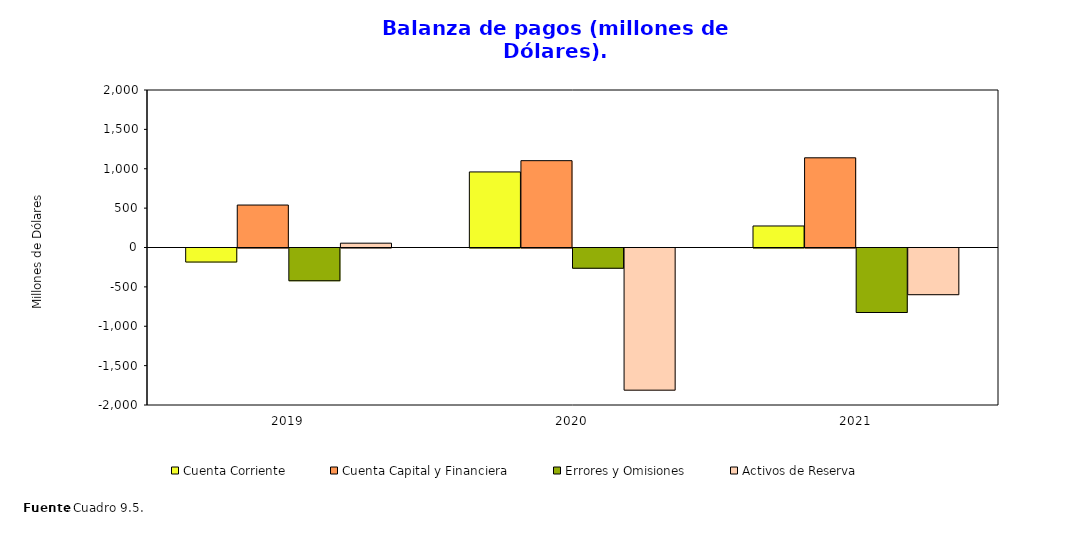
| Category | Cuenta Corriente | Cuenta Capital y Financiera | Errores y Omisiones | Activos de Reserva |
|---|---|---|---|---|
| 2019.0 | -178.179 | 539.279 | -415.972 | 54.872 |
| 2020.0 | 959.673 | 1102.594 | -257.055 | -1805.212 |
| 2021.0 | 273.266 | 1138.943 | -819.19 | -593.019 |